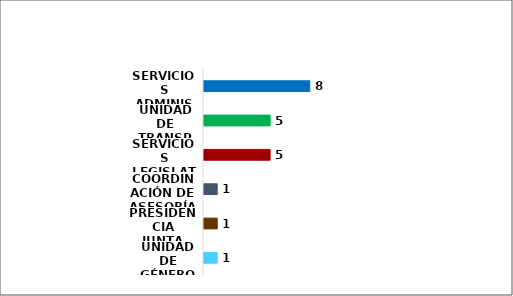
| Category | Series 0 |
|---|---|
| UNIDAD DE GÉNERO | 1 |
| PRESIDENCIA JUNTA GOBIERNO | 1 |
| COORDINACIÓN DE ASESORÍA | 1 |
| SERVICIOS LEGISLATIVOS | 5 |
| UNIDAD DE TRANSPARENCIA | 5 |
| SERVICIOS ADMINISTRATIVOS | 8 |